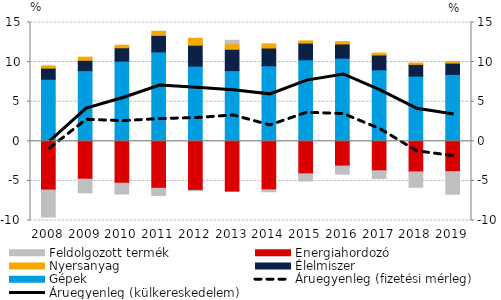
| Category | Gépek | Élelmiszer | Nyersanyag | Energiahordozó | Feldolgozott termék |
|---|---|---|---|---|---|
| 2008.0 | 7.841 | 1.399 | 0.277 | -6.156 | -3.403 |
| 2009.0 | 8.919 | 1.305 | 0.4 | -4.781 | -1.72 |
| 2010.0 | 10.126 | 1.682 | 0.319 | -5.29 | -1.371 |
| 2011.0 | 11.293 | 2.079 | 0.52 | -5.933 | -0.92 |
| 2012.0 | 9.492 | 2.642 | 0.873 | -6.2 | -0.043 |
| 2013.0 | 8.929 | 2.689 | 0.711 | -6.295 | 0.421 |
| 2014.0 | 9.537 | 2.242 | 0.519 | -6.132 | -0.24 |
| 2015.0 | 10.294 | 2.1 | 0.281 | -4.106 | -0.909 |
| 2016.0 | 10.494 | 1.796 | 0.297 | -3.131 | -1.018 |
| 2017.0 | 9.024 | 1.871 | 0.238 | -3.724 | -0.97 |
| 2018.0 | 8.235 | 1.478 | 0.176 | -3.863 | -1.947 |
| 2019.0 | 8.444 | 1.427 | 0.195 | -3.832 | -2.851 |